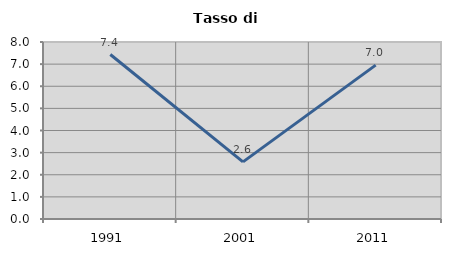
| Category | Tasso di disoccupazione   |
|---|---|
| 1991.0 | 7.434 |
| 2001.0 | 2.581 |
| 2011.0 | 6.957 |